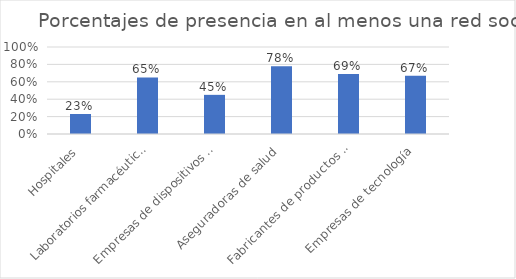
| Category | Presencia en al menos una red social |
|---|---|
| Hospitales | 0.23 |
| Laboratorios farmacéuticos | 0.65 |
| Empresas de dispositivos biomédicos | 0.45 |
| Aseguradoras de salud | 0.78 |
| Fabricantes de productos sanitarios | 0.69 |
| Empresas de tecnología | 0.67 |